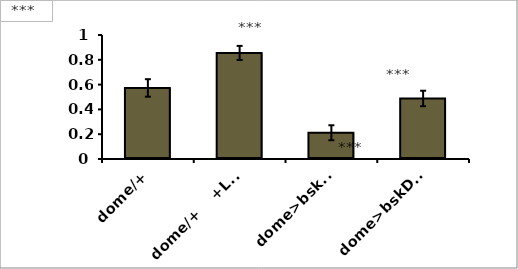
| Category | Series 0 |
|---|---|
| dome/+ | 0.573 |
| dome/+    +L-carnitine | 0.855 |
| dome>bskDN | 0.212 |
| dome>bskDN  +L-carnitine | 0.488 |